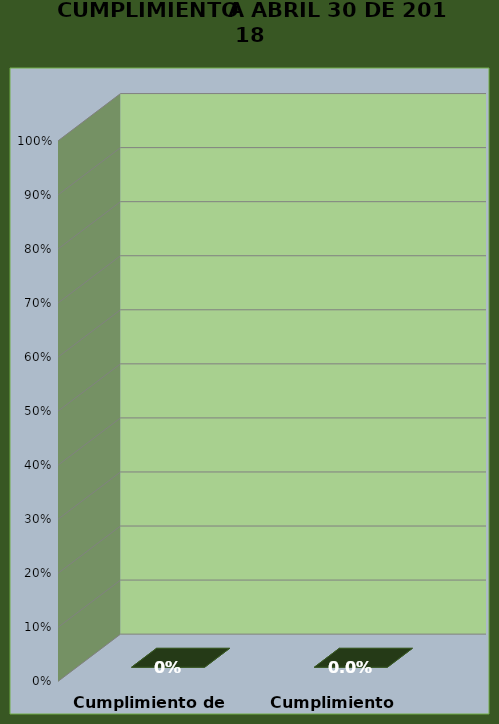
| Category | 30-abr.-18 |
|---|---|
| Cumplimiento de Hitos | 0 |
| Cumplimiento Temporal | 0 |